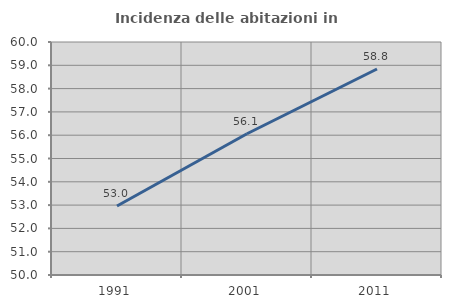
| Category | Incidenza delle abitazioni in proprietà  |
|---|---|
| 1991.0 | 52.962 |
| 2001.0 | 56.063 |
| 2011.0 | 58.842 |